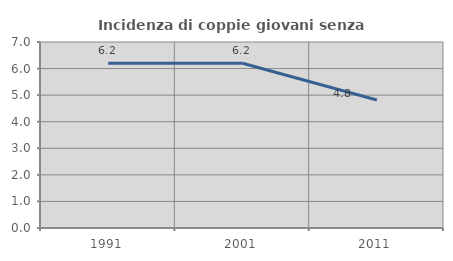
| Category | Incidenza di coppie giovani senza figli |
|---|---|
| 1991.0 | 6.198 |
| 2001.0 | 6.198 |
| 2011.0 | 4.815 |